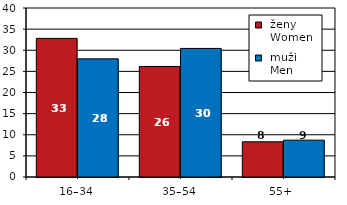
| Category |  ženy 
 Women |  muži 
 Men |
|---|---|---|
| 16–34 | 32.814 | 27.965 |
| 35–54 | 26.157 | 30.431 |
| 55+  | 8.337 | 8.726 |